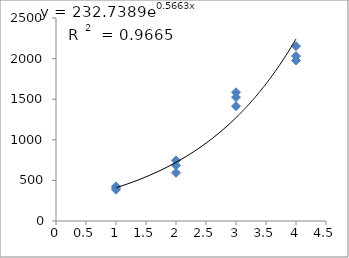
| Category | Series 0 |
|---|---|
| 1.0 | 385.498 |
| 1.0 | 426.035 |
| 1.0 | 409.343 |
| 2.0 | 747.383 |
| 2.0 | 685.434 |
| 2.0 | 593.51 |
| 3.0 | 1413.493 |
| 3.0 | 1524.553 |
| 3.0 | 1585.131 |
| 4.0 | 2031.6 |
| 4.0 | 2153.266 |
| 4.0 | 1976.506 |